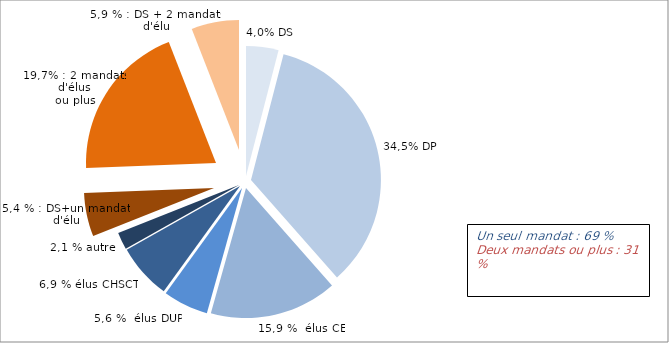
| Category | Series 0 |
|---|---|
| DS | 4.03 |
| DP  | 34.48 |
| Elu CE  | 15.87 |
| Elu DUP ou instance unique  | 5.62 |
| 1 mandat d'élu au CHSCT  | 6.86 |
| 1 autre mandat | 2.15 |
| DS + 1 mandat élu | 5.42 |
| 2 mandats d'élus ou plus | 19.69 |
| DS + 2 mandats élus ou plus | 5.92 |